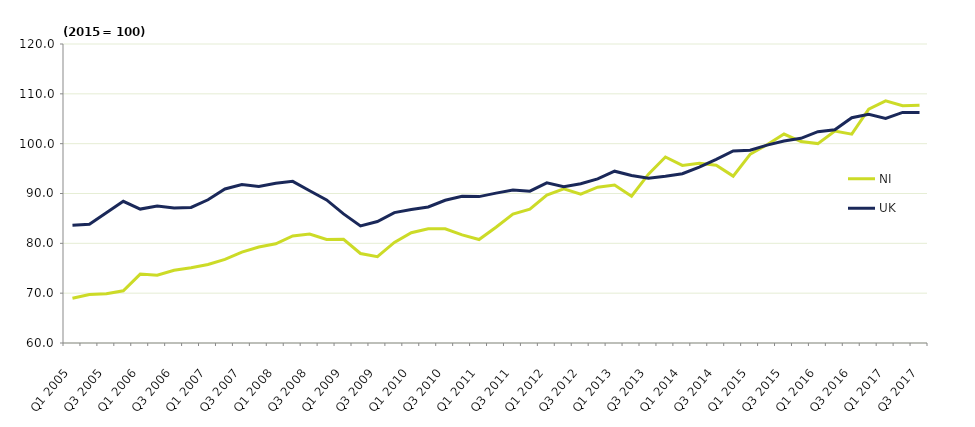
| Category | NI  | UK  |
|---|---|---|
| Q1 2005 | 68.962 | 83.64 |
| Q2 2005 | 69.722 | 83.84 |
| Q3 2005 | 69.894 | 86.14 |
| Q4 2005 | 70.48 | 88.441 |
| Q1 2006 | 73.831 | 86.874 |
| Q2 2006 | 73.607 | 87.474 |
| Q3 2006 | 74.586 | 87.074 |
| Q4 2006 | 75.114 | 87.207 |
| Q1 2007 | 75.761 | 88.741 |
| Q2 2007 | 76.779 | 90.908 |
| Q3 2007 | 78.243 | 91.808 |
| Q4 2007 | 79.267 | 91.408 |
| Q1 2008 | 79.903 | 92.041 |
| Q2 2008 | 81.488 | 92.441 |
| Q3 2008 | 81.857 | 90.541 |
| Q4 2008 | 80.762 | 88.707 |
| Q1 2009 | 80.812 | 85.907 |
| Q2 2009 | 77.962 | 83.507 |
| Q3 2009 | 77.316 | 84.374 |
| Q4 2009 | 80.172 | 86.174 |
| Q1 2010 | 82.138 | 86.807 |
| Q2 2010 | 82.926 | 87.307 |
| Q3 2010 | 82.907 | 88.641 |
| Q4 2010 | 81.691 | 89.441 |
| Q1 2011 | 80.77 | 89.374 |
| Q2 2011 | 83.24 | 90.074 |
| Q3 2011 | 85.876 | 90.708 |
| Q4 2011 | 86.855 | 90.474 |
| Q1 2012 | 89.677 | 92.141 |
| Q2 2012 | 90.924 | 91.374 |
| Q3 2012 | 89.879 | 91.974 |
| Q4 2012 | 91.259 | 92.941 |
| Q1 2013 | 91.705 | 94.475 |
| Q2 2013 | 89.46 | 93.608 |
| Q3 2013 | 93.887 | 93.074 |
| Q4 2013 | 97.326 | 93.474 |
| Q1 2014 | 95.629 | 93.974 |
| Q2 2014 | 96.091 | 95.308 |
| Q3 2014 | 95.666 | 96.841 |
| Q4 2014 | 93.485 | 98.542 |
| Q1 2015 | 97.865 | 98.675 |
| Q2 2015 | 99.795 | 99.708 |
| Q3 2015 | 101.926 | 100.542 |
| Q4 2015 | 100.415 | 101.075 |
| Q1 2016 | 100.015 | 102.409 |
| Q2 2016 | 102.533 | 102.775 |
| Q3 2016 | 101.916 | 105.209 |
| Q4 2016 | 106.94 | 105.875 |
| Q1 2017 | 108.606 | 105.075 |
| Q2 2017 | 107.599 | 106.276 |
| Q3 2017 | 107.733 | 106.276 |